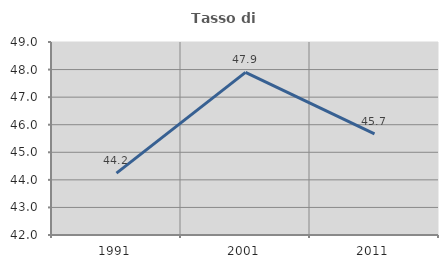
| Category | Tasso di occupazione   |
|---|---|
| 1991.0 | 44.244 |
| 2001.0 | 47.899 |
| 2011.0 | 45.666 |